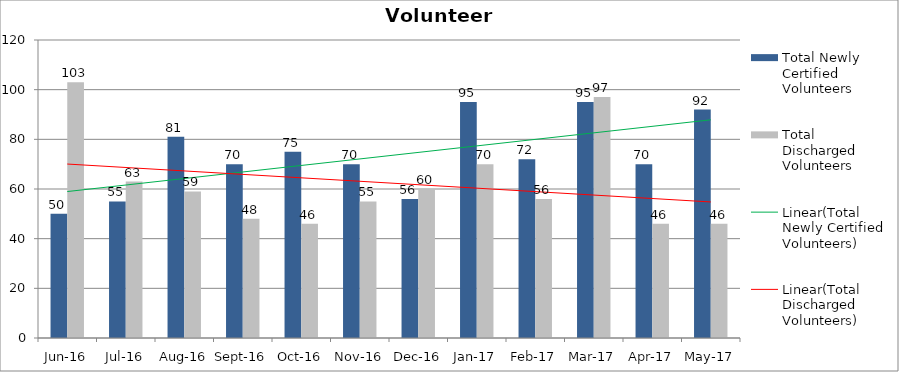
| Category | Total Newly Certified Volunteers | Total Discharged Volunteers |
|---|---|---|
| Jun-16 | 50 | 103 |
| Jul-16 | 55 | 63 |
| Aug-16 | 81 | 59 |
| Sep-16 | 70 | 48 |
| Oct-16 | 75 | 46 |
| Nov-16 | 70 | 55 |
| Dec-16 | 56 | 60 |
| Jan-17 | 95 | 70 |
| Feb-17 | 72 | 56 |
| Mar-17 | 95 | 97 |
| Apr-17 | 70 | 46 |
| May-17 | 92 | 46 |